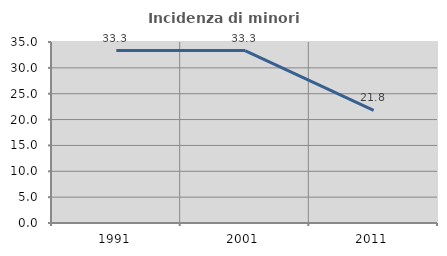
| Category | Incidenza di minori stranieri |
|---|---|
| 1991.0 | 33.333 |
| 2001.0 | 33.333 |
| 2011.0 | 21.795 |